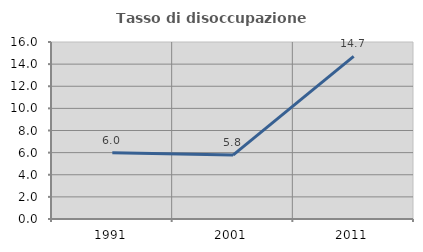
| Category | Tasso di disoccupazione giovanile  |
|---|---|
| 1991.0 | 5.978 |
| 2001.0 | 5.78 |
| 2011.0 | 14.706 |